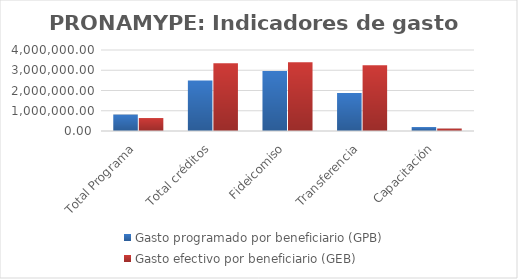
| Category | Gasto programado por beneficiario (GPB)  | Gasto efectivo por beneficiario (GEB)  |
|---|---|---|
| Total Programa | 812500 | 639570.927 |
| Total créditos | 2500000 | 3346524.046 |
| Fideicomiso | 2965116.279 | 3392234.45 |
| Transferencia | 1875000 | 3243243.243 |
| Capacitación | 195121.951 | 121382.758 |